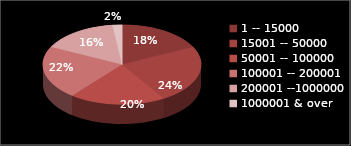
| Category | Series 0 | Series 1 |
|---|---|---|
| 1 -- 15000 | 9 | 0.176 |
| 15001 -- 50000 | 12 | 0.235 |
| 50001 -- 100000 | 10 | 0.196 |
| 100001 -- 200001 | 11 | 0.216 |
| 200001 --1000000 | 8 | 0.157 |
| 1000001 & over | 1 | 0.02 |